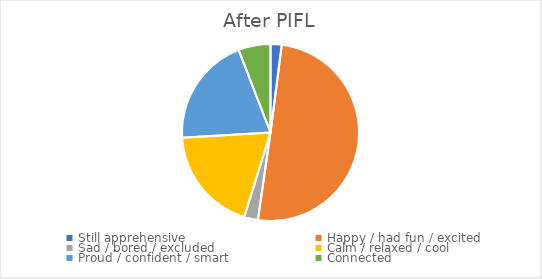
| Category | After PIFL |
|---|---|
| Still apprehensive | 0.024 |
| Happy / had fun / excited | 0.6 |
| Sad / bored / excluded | 0.03 |
| Calm / relaxed / cool | 0.23 |
| Proud / confident / smart | 0.24 |
| Connected | 0.07 |